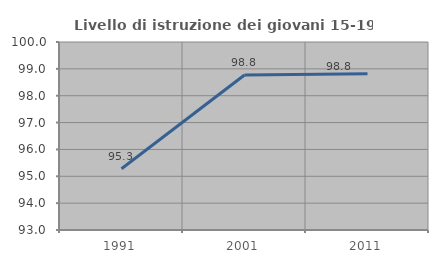
| Category | Livello di istruzione dei giovani 15-19 anni |
|---|---|
| 1991.0 | 95.282 |
| 2001.0 | 98.771 |
| 2011.0 | 98.82 |